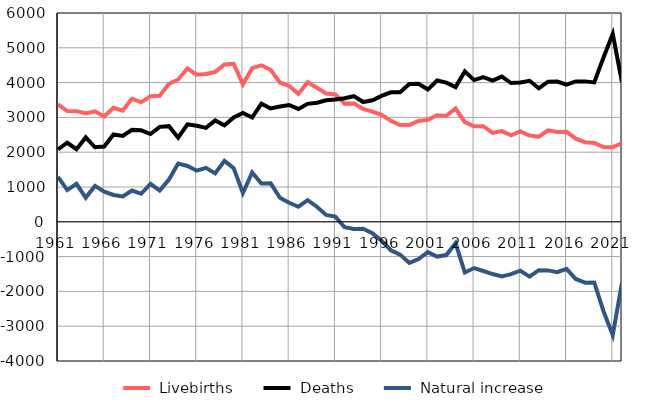
| Category |  Livebirths |  Deaths |  Natural increase |
|---|---|---|---|
| 1961.0 | 3373 | 2080 | 1293 |
| 1962.0 | 3183 | 2272 | 911 |
| 1963.0 | 3179 | 2087 | 1092 |
| 1964.0 | 3116 | 2425 | 691 |
| 1965.0 | 3175 | 2141 | 1034 |
| 1966.0 | 3027 | 2163 | 864 |
| 1967.0 | 3278 | 2508 | 770 |
| 1968.0 | 3196 | 2466 | 730 |
| 1969.0 | 3539 | 2641 | 898 |
| 1970.0 | 3433 | 2628 | 805 |
| 1971.0 | 3610 | 2521 | 1089 |
| 1972.0 | 3624 | 2728 | 896 |
| 1973.0 | 3963 | 2749 | 1214 |
| 1974.0 | 4091 | 2415 | 1676 |
| 1975.0 | 4406 | 2801 | 1605 |
| 1976.0 | 4226 | 2758 | 1468 |
| 1977.0 | 4250 | 2700 | 1550 |
| 1978.0 | 4303 | 2913 | 1390 |
| 1979.0 | 4522 | 2771 | 1751 |
| 1980.0 | 4538 | 2996 | 1542 |
| 1981.0 | 3950 | 3125 | 825 |
| 1982.0 | 4415 | 2997 | 1418 |
| 1983.0 | 4497 | 3396 | 1101 |
| 1984.0 | 4366 | 3257 | 1109 |
| 1985.0 | 4003 | 3314 | 689 |
| 1986.0 | 3904 | 3357 | 547 |
| 1987.0 | 3676 | 3243 | 433 |
| 1988.0 | 4011 | 3389 | 622 |
| 1989.0 | 3853 | 3420 | 433 |
| 1990.0 | 3686 | 3490 | 196 |
| 1991.0 | 3661 | 3512 | 149 |
| 1992.0 | 3396 | 3552 | -156 |
| 1993.0 | 3402 | 3610 | -208 |
| 1994.0 | 3244 | 3441 | -197 |
| 1995.0 | 3166 | 3491 | -325 |
| 1996.0 | 3073 | 3618 | -545 |
| 1997.0 | 2902 | 3720 | -818 |
| 1998.0 | 2783 | 3725 | -942 |
| 1999.0 | 2779 | 3961 | -1182 |
| 2000.0 | 2898 | 3967 | -1069 |
| 2001.0 | 2928 | 3800 | -872 |
| 2002.0 | 3060 | 4059 | -999 |
| 2003.0 | 3043 | 3999 | -956 |
| 2004.0 | 3255 | 3871 | -616 |
| 2005.0 | 2863 | 4320 | -1457 |
| 2006.0 | 2743 | 4072 | -1329 |
| 2007.0 | 2746 | 4159 | -1413 |
| 2008.0 | 2557 | 4058 | -1501 |
| 2009.0 | 2606 | 4173 | -1567 |
| 2010.0 | 2483 | 3987 | -1504 |
| 2011.0 | 2597 | 4002 | -1405 |
| 2012.0 | 2477 | 4052 | -1575 |
| 2013.0 | 2446 | 3837 | -1391 |
| 2014.0 | 2629 | 4025 | -1396 |
| 2015.0 | 2581 | 4029 | -1448 |
| 2016.0 | 2586 | 3939 | -1353 |
| 2017.0 | 2390 | 4033 | -1643 |
| 2018.0 | 2287 | 4035 | -1748 |
| 2019.0 | 2263 | 4005 | -1742 |
| 2020.0 | 2150 | 4720 | -2570 |
| 2021.0 | 2144 | 5399 | -3255 |
| 2022.0 | 2257 | 4006 | -1749 |